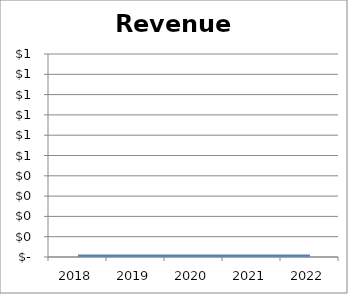
| Category | Revenues |
|---|---|
| 2018.0 | 0 |
| 2019.0 | 0 |
| 2020.0 | 0 |
| 2021.0 | 0 |
| 2022.0 | 0 |